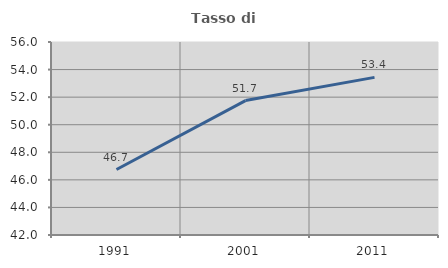
| Category | Tasso di occupazione   |
|---|---|
| 1991.0 | 46.749 |
| 2001.0 | 51.75 |
| 2011.0 | 53.433 |